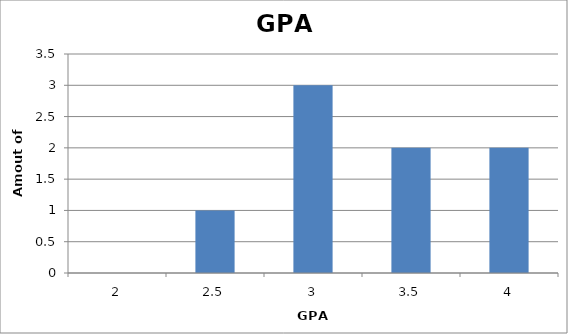
| Category | Series 0 |
|---|---|
| 2.0 | 0 |
| 2.5 | 1 |
| 3.0 | 3 |
| 3.5 | 2 |
| 4.0 | 2 |